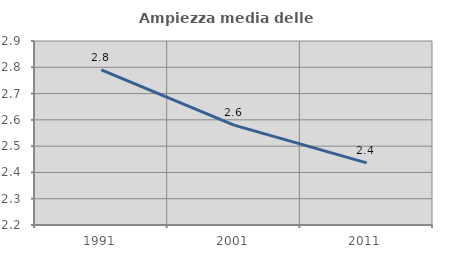
| Category | Ampiezza media delle famiglie |
|---|---|
| 1991.0 | 2.791 |
| 2001.0 | 2.58 |
| 2011.0 | 2.436 |